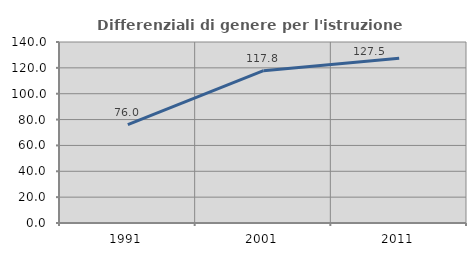
| Category | Differenziali di genere per l'istruzione superiore |
|---|---|
| 1991.0 | 76.037 |
| 2001.0 | 117.811 |
| 2011.0 | 127.485 |